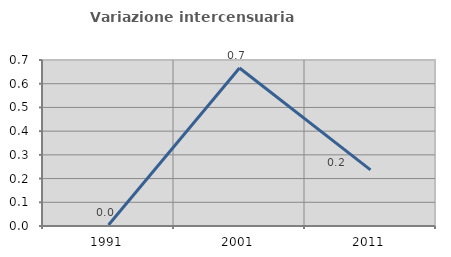
| Category | Variazione intercensuaria annua |
|---|---|
| 1991.0 | 0.004 |
| 2001.0 | 0.666 |
| 2011.0 | 0.237 |